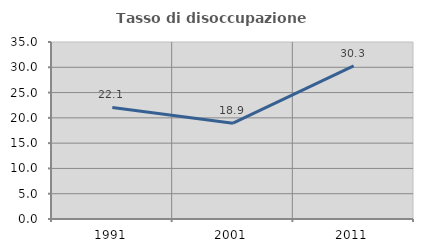
| Category | Tasso di disoccupazione giovanile  |
|---|---|
| 1991.0 | 22.053 |
| 2001.0 | 18.95 |
| 2011.0 | 30.27 |